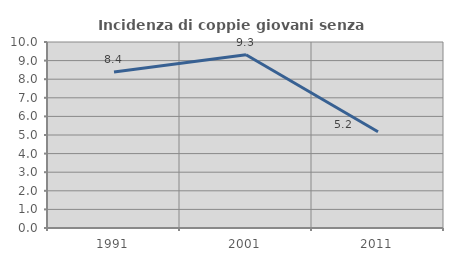
| Category | Incidenza di coppie giovani senza figli |
|---|---|
| 1991.0 | 8.389 |
| 2001.0 | 9.311 |
| 2011.0 | 5.172 |